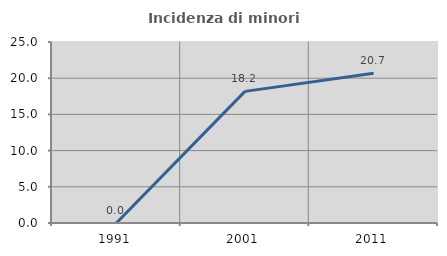
| Category | Incidenza di minori stranieri |
|---|---|
| 1991.0 | 0 |
| 2001.0 | 18.182 |
| 2011.0 | 20.69 |